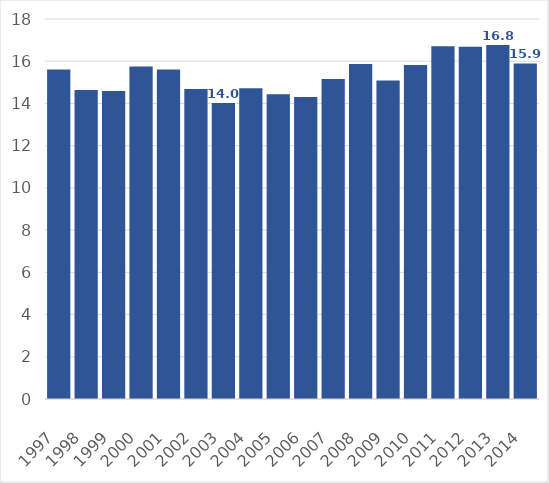
| Category | Total Privado |
|---|---|
| 1997.0 | 15.603 |
| 1998.0 | 14.643 |
| 1999.0 | 14.584 |
| 2000.0 | 15.753 |
| 2001.0 | 15.611 |
| 2002.0 | 14.681 |
| 2003.0 | 14.015 |
| 2004.0 | 14.721 |
| 2005.0 | 14.433 |
| 2006.0 | 14.303 |
| 2007.0 | 15.159 |
| 2008.0 | 15.867 |
| 2009.0 | 15.085 |
| 2010.0 | 15.817 |
| 2011.0 | 16.705 |
| 2012.0 | 16.686 |
| 2013.0 | 16.767 |
| 2014.0 | 15.893 |